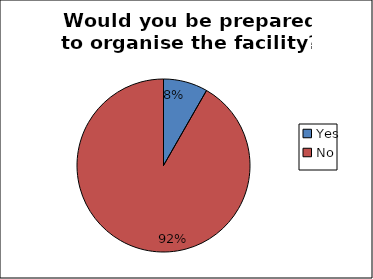
| Category | Series 0 |
|---|---|
| Yes | 0.083 |
| No | 0.917 |